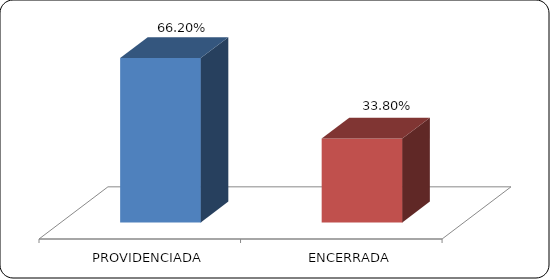
| Category | Series 0 |
|---|---|
|      PROVIDENCIADA | 0.662 |
|      ENCERRADA | 0.338 |